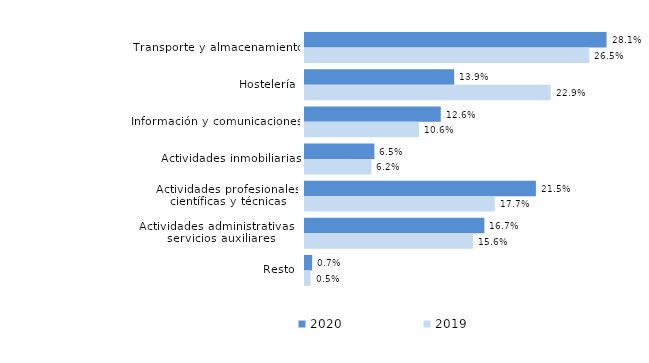
| Category | 2020 | 2019 |
|---|---|---|
| Transporte y almacenamiento | 0.281 | 0.265 |
| Hostelería | 0.139 | 0.229 |
| Información y comunicaciones | 0.126 | 0.106 |
| Actividades inmobiliarias | 0.065 | 0.062 |
| Actividades profesionales, científicas y técnicas | 0.215 | 0.177 |
| Actividades administrativas y servicios auxiliares | 0.167 | 0.156 |
| Resto | 0.007 | 0.005 |